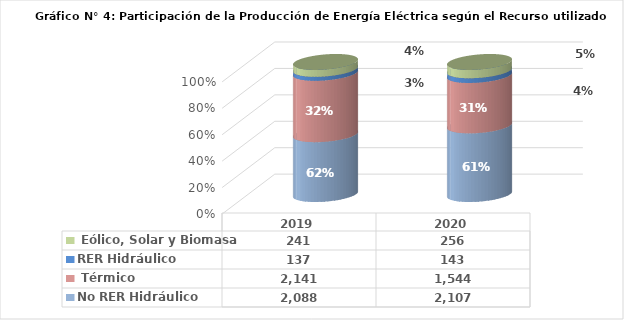
| Category | No RER | RER |
|---|---|---|
| 2019.0 | 2141.486 | 240.788 |
| 2020.0 | 1544.494 | 255.912 |